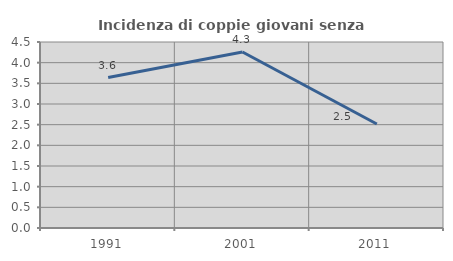
| Category | Incidenza di coppie giovani senza figli |
|---|---|
| 1991.0 | 3.64 |
| 2001.0 | 4.258 |
| 2011.0 | 2.517 |